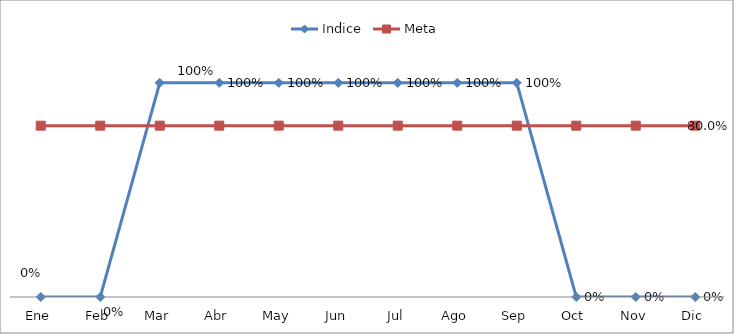
| Category | Indice | Meta |
|---|---|---|
| Ene | 0 | 0.8 |
| Feb | 0 | 0.8 |
| Mar | 1 | 0.8 |
| Abr | 1 | 0.8 |
| May | 1 | 0.8 |
| Jun | 1 | 0.8 |
| Jul | 1 | 0.8 |
| Ago | 1 | 0.8 |
| Sep | 1 | 0.8 |
| Oct | 0 | 0.8 |
| Nov | 0 | 0.8 |
| Dic | 0 | 0.8 |